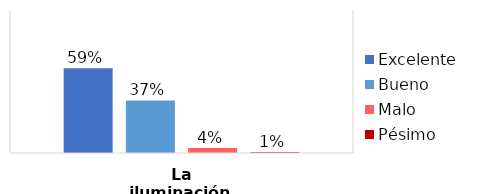
| Category | Excelente | Bueno | Malo | Pésimo |
|---|---|---|---|---|
| La iluminación | 0.592 | 0.367 | 0.036 | 0.005 |